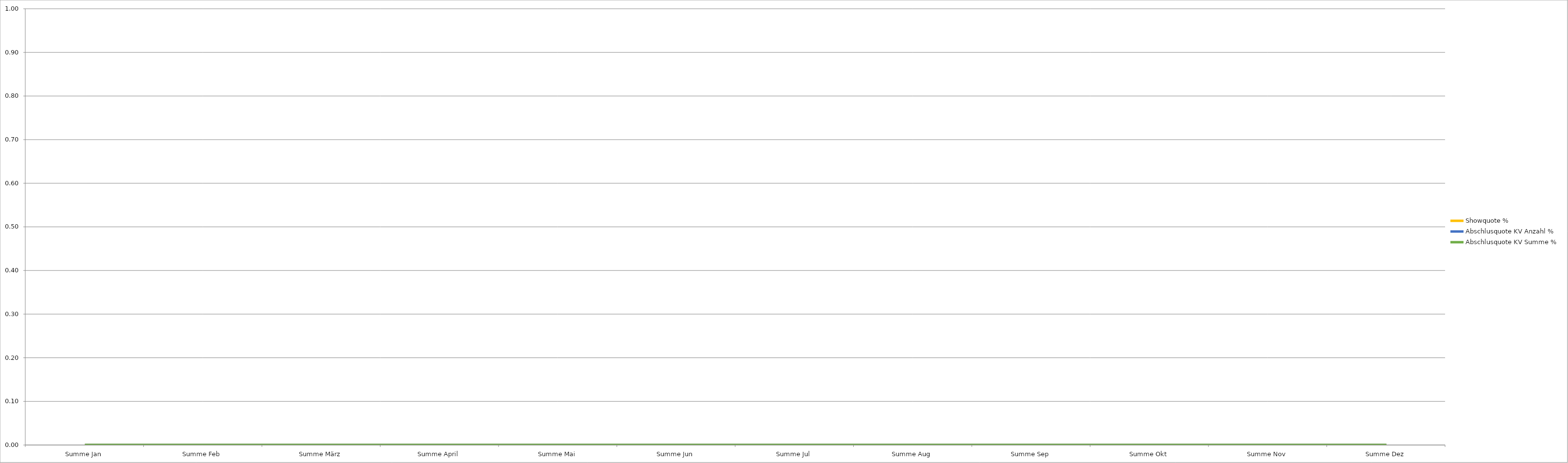
| Category | Showquote % | Abschlusquote KV Anzahl % | Abschlusquote KV Summe % |
|---|---|---|---|
| Summe Jan | 0 | 0 | 0 |
| Summe Feb | 0 | 0 | 0 |
| Summe März | 0 | 0 | 0 |
| Summe April | 0 | 0 | 0 |
| Summe Mai | 0 | 0 | 0 |
| Summe Jun | 0 | 0 | 0 |
| Summe Jul | 0 | 0 | 0 |
| Summe Aug | 0 | 0 | 0 |
| Summe Sep | 0 | 0 | 0 |
| Summe Okt | 0 | 0 | 0 |
| Summe Nov | 0 | 0 | 0 |
| Summe Dez | 0 | 0 | 0 |